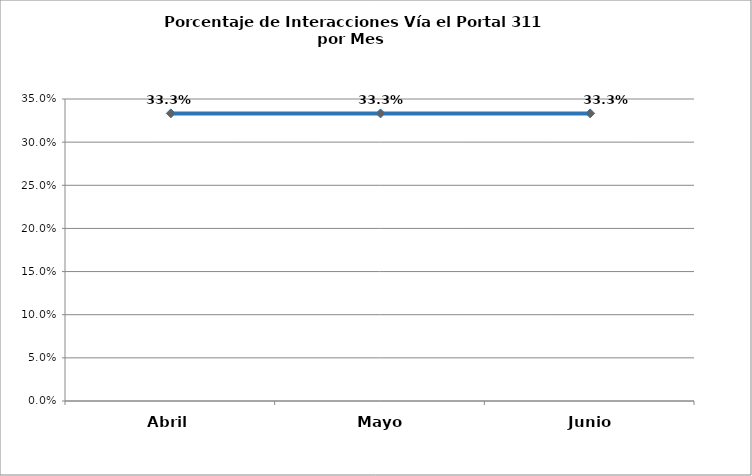
| Category | Series 0 |
|---|---|
| Abril | 0.333 |
| Mayo | 0.333 |
| Junio | 0.333 |